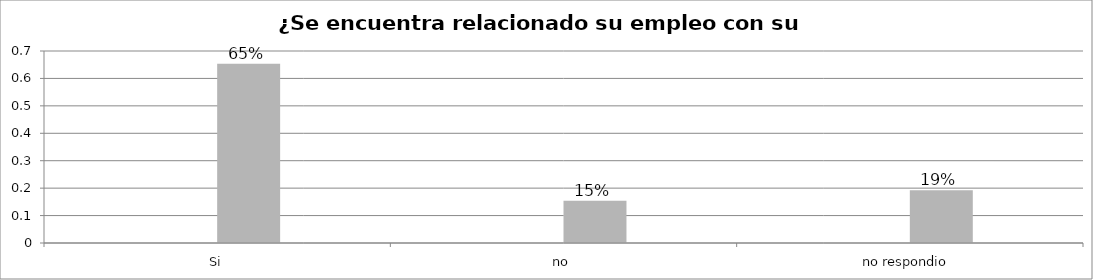
| Category | Series 0 | Series 1 | Series 2 | Series 3 |
|---|---|---|---|---|
| Si |  |  | 0.654 |  |
| no  |  |  | 0.154 |  |
| no respondio  |  |  | 0.192 |  |